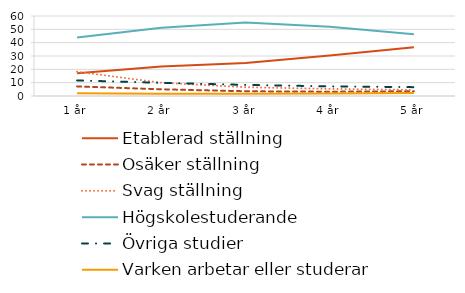
| Category | Etablerad ställning | Osäker ställning | Svag ställning | Högskolestuderande | Övriga studier | Varken arbetar eller studerar |
|---|---|---|---|---|---|---|
| 1 år | 17.04 | 7.17 | 18.21 | 43.88 | 11.69 | 2.01 |
| 2 år | 22.19 | 5.04 | 9.96 | 51.17 | 9.87 | 1.78 |
| 3 år | 24.79 | 3.56 | 6.59 | 55.1 | 8.33 | 1.62 |
| 4 år | 30.45 | 3.23 | 5.34 | 51.9 | 7.21 | 1.88 |
| 5 år | 36.55 | 3.57 | 4.57 | 46.35 | 6.64 | 2.32 |